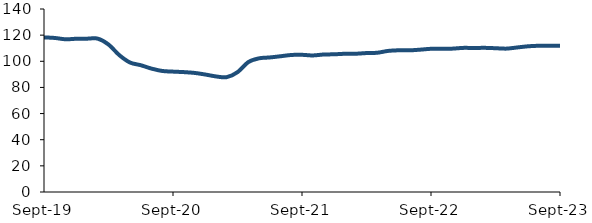
| Category | Series 0 |
|---|---|
| 2019-09-01 | 118.287 |
| 2019-10-01 | 117.85 |
| 2019-11-01 | 116.835 |
| 2019-12-01 | 117.224 |
| 2020-01-01 | 117.309 |
| 2020-02-01 | 117.318 |
| 2020-03-01 | 112.843 |
| 2020-04-01 | 104.749 |
| 2020-05-01 | 99.065 |
| 2020-06-01 | 97 |
| 2020-07-01 | 94.403 |
| 2020-08-01 | 92.588 |
| 2020-09-01 | 92.095 |
| 2020-10-01 | 91.72 |
| 2020-11-01 | 91.108 |
| 2020-12-01 | 89.884 |
| 2021-01-01 | 88.42 |
| 2021-02-01 | 87.87 |
| 2021-03-01 | 91.662 |
| 2021-04-01 | 99.36 |
| 2021-05-01 | 102.252 |
| 2021-06-01 | 102.937 |
| 2021-07-01 | 103.85 |
| 2021-08-01 | 104.82 |
| 2021-09-01 | 104.952 |
| 2021-10-01 | 104.465 |
| 2021-11-01 | 105.171 |
| 2021-12-01 | 105.344 |
| 2022-01-01 | 105.752 |
| 2022-02-01 | 105.784 |
| 2022-03-01 | 106.289 |
| 2022-04-01 | 106.52 |
| 2022-05-01 | 107.933 |
| 2022-06-01 | 108.418 |
| 2022-07-01 | 108.373 |
| 2022-08-01 | 108.898 |
| 2022-09-01 | 109.553 |
| 2022-10-01 | 109.61 |
| 2022-11-01 | 109.687 |
| 2022-12-01 | 110.251 |
| 2023-01-01 | 110.176 |
| 2023-02-01 | 110.279 |
| 2023-03-01 | 110.001 |
| 2023-04-01 | 109.685 |
| 2023-05-01 | 110.559 |
| 2023-06-01 | 111.451 |
| 2023-07-01 | 111.863 |
| 2023-08-01 | 111.819 |
| 2023-09-01 | 111.804 |